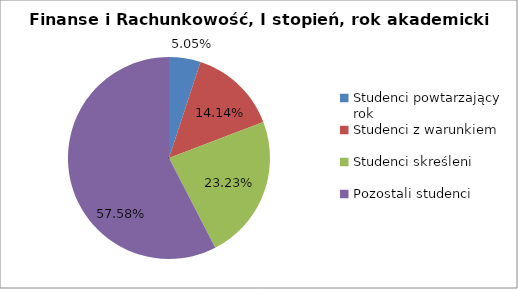
| Category | Series 0 |
|---|---|
| Studenci powtarzający rok | 5 |
| Studenci z warunkiem | 14 |
| Studenci skreśleni | 23 |
| Pozostali studenci | 57 |